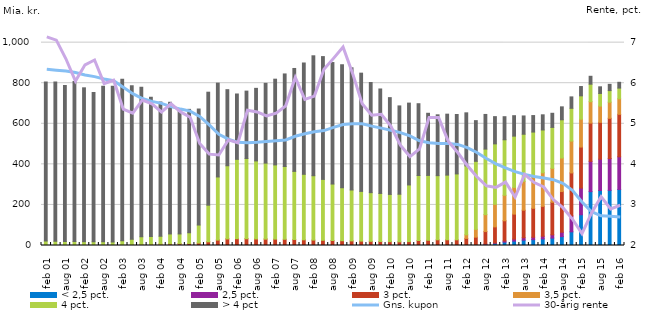
| Category | < 2,5 pct. | 2,5 pct. | 3 pct. | 3,5 pct. | 4 pct. | > 4 pct |
|---|---|---|---|---|---|---|
| feb 01 | 0 | 0 | 0 | 0.1 | 21.8 | 783.5 |
| maj 01 | 0 | 0 | 0 | 0.1 | 21.2 | 784.1 |
| aug 01 | 0 | 0 | 0 | 0.1 | 19.6 | 769.6 |
| nov 01 | 0 | 0 | 0 | 0.1 | 19.2 | 789 |
| feb 02 | 0 | 0 | 0 | 0.1 | 18.7 | 758.5 |
| maj 02 | 0 | 0 | 0 | 0.1 | 18.1 | 736.4 |
| aug 02 | 0 | 0 | 0 | 0.1 | 18.1 | 767.2 |
| nov 02 | 0 | 0 | 0.1 | 0.1 | 17.3 | 767.2 |
| feb 03 | 0 | 0 | 1.7 | 0.1 | 22 | 796.3 |
| maj 03 | 0 | 0 | 3.7 | 0.1 | 27.5 | 755.9 |
| aug 03 | 0 | 0 | 5.5 | 0.1 | 37.3 | 737.6 |
| nov 03 | 0 | 0 | 6.1 | 0.1 | 37.7 | 686.7 |
| feb 04 | 0 | 0 | 6.7 | 0.1 | 39.1 | 661.3 |
| maj 04 | 0 | 0 | 8.5 | 0.1 | 48.4 | 649.1 |
| aug 04 | 0 | 0 | 9 | 0.1 | 47.9 | 609.8 |
| nov 04 | 0 | 0 | 10 | 0.1 | 52.8 | 608.2 |
| feb 05 | 0 | 0 | 12.7 | 0.1 | 88.1 | 571.9 |
| maj 05 | 0 | 0 | 18.6 | 0.1 | 180.1 | 556.9 |
| aug 05 | 0 | 0 | 27.4 | 0.1 | 310.4 | 462.5 |
| nov 05 | 0 | 0 | 32.9 | 0.1 | 360.1 | 375 |
| feb 06 | 0 | 0 | 33.8 | 0.1 | 390.9 | 322.1 |
| maj 06 | 0 | 0 | 33.6 | 0.1 | 395.3 | 332 |
| aug 06 | 0 | 0 | 32.9 | 0.1 | 384 | 357.7 |
| nov 06 | 0 | 0 | 32.1 | 0.1 | 373.9 | 393.3 |
| feb 07 | 0 | 0 | 31.4 | 0 | 365.9 | 422.6 |
| maj 07 | 0 | 0 | 30.7 | 0 | 358.6 | 456.4 |
| aug 07 | 0 | 0 | 29.5 | 0 | 335.9 | 507.3 |
| nov 07 | 0 | 0 | 28.1 | 0 | 322.9 | 548.7 |
| feb 08 | 0 | 0 | 26.8 | 0 | 317.2 | 591.2 |
| maj 08 | 0 | 0 | 25.8 | 0 | 300.1 | 605.3 |
| aug 08 | 0 | 0 | 24.6 | 0 | 278.4 | 598.9 |
| nov 08 | 0 | 0 | 23.6 | 0 | 261.1 | 606.3 |
| feb 09 | 0 | 0 | 22.7 | 0 | 251 | 602.2 |
| maj 09 | 0 | 0 | 21.7 | 0 | 245 | 582.9 |
| aug 09 | 0 | 0 | 20.8 | 0 | 239.8 | 543 |
| nov 09 | 0 | 0 | 19.9 | 0 | 236.7 | 515 |
| feb 10 | 0 | 0 | 19.1 | 0 | 232.7 | 477.1 |
| maj 10 | 0 | 0 | 18.2 | 0 | 234.6 | 435.3 |
| aug 10 | 0 | 0 | 19.3 | 0 | 279.2 | 403.4 |
| nov 10 | 0 | 0 | 24.6 | 0 | 320.6 | 353.7 |
| feb 11 | 0 | 0 | 25.8 | 0 | 319.7 | 306.3 |
| maj 11 | 0 | 0 | 28.2 | 0 | 316.1 | 299.9 |
| aug 11 | 0 | 0 | 28.2 | 0 | 318.8 | 300.4 |
| nov 11 | 0 | 0 | 28.1 | 0 | 324.8 | 293 |
| feb 12 | 0 | 0 | 34.9 | 17.8 | 339.9 | 261.4 |
| maj 12 | 0 | 0 | 41.1 | 38.7 | 335.1 | 200.6 |
| aug 12 | 5.4 | 1.2 | 62.1 | 83.5 | 323 | 170.9 |
| nov 12 | 10.5 | 2.2 | 79.1 | 111.5 | 297.7 | 134.2 |
| feb 13 | 16.5 | 5.8 | 99.6 | 125.8 | 273.5 | 113.7 |
| maj 13 | 21.8 | 9.8 | 123.1 | 131.7 | 252.7 | 100.8 |
| aug 13 | 26.4 | 11.9 | 135.7 | 142.2 | 232.3 | 90.1 |
| nov 13 | 28.7 | 12.1 | 142.6 | 155.8 | 220.1 | 81.2 |
| feb 14 | 32.8 | 13 | 147.3 | 165.4 | 211.1 | 74.6 |
| maj 14 | 36.6 | 16 | 160.3 | 167.6 | 201.7 | 69.6 |
| aug 14 | 43.9 | 21.6 | 200.4 | 165.4 | 188.4 | 63.8 |
| nov 14 | 67.5 | 78.5 | 211.7 | 157.1 | 161.5 | 56.3 |
| feb 15 | 151.6 | 131.4 | 202.3 | 137.5 | 115 | 45.8 |
| maj 15 | 265.6 | 149.4 | 188.6 | 105.3 | 86.3 | 39 |
| aug 15 | 271.2 | 154.5 | 181.4 | 80.2 | 62.2 | 32.7 |
| nov 15 | 271.8 | 156.7 | 198.5 | 79.5 | 57.1 | 30.8 |
| feb 16 | 276.2 | 161.1 | 209.4 | 76.6 | 52.7 | 28.5 |